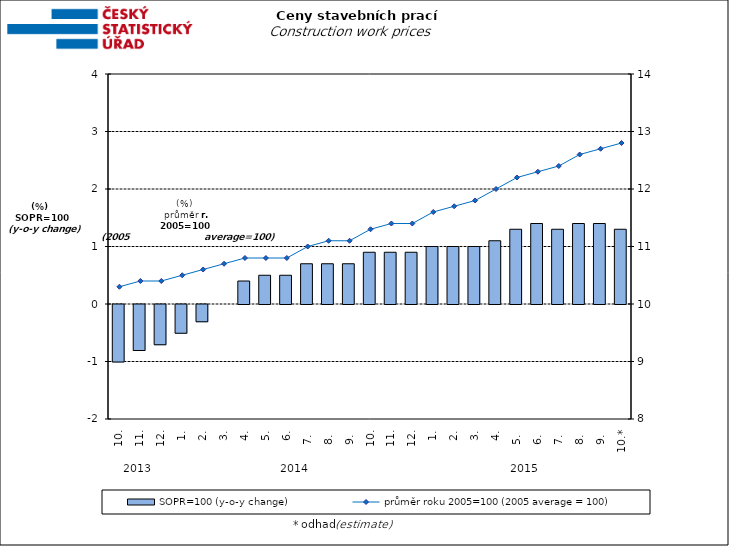
| Category | SOPR=100 (y-o-y change)   |
|---|---|
| 0 | -1 |
| 1 | -0.8 |
| 2 | -0.7 |
| 3 | -0.5 |
| 4 | -0.3 |
| 5 | 0 |
| 6 | 0.4 |
| 7 | 0.5 |
| 8 | 0.5 |
| 9 | 0.7 |
| 10 | 0.7 |
| 11 | 0.7 |
| 12 | 0.9 |
| 13 | 0.9 |
| 14 | 0.9 |
| 15 | 1 |
| 16 | 1 |
| 17 | 1 |
| 18 | 1.1 |
| 19 | 1.3 |
| 20 | 1.4 |
| 21 | 1.3 |
| 22 | 1.4 |
| 23 | 1.4 |
| 24 | 1.3 |